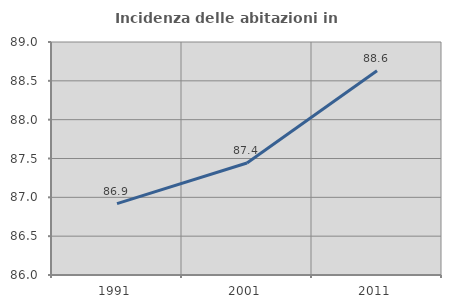
| Category | Incidenza delle abitazioni in proprietà  |
|---|---|
| 1991.0 | 86.919 |
| 2001.0 | 87.442 |
| 2011.0 | 88.63 |